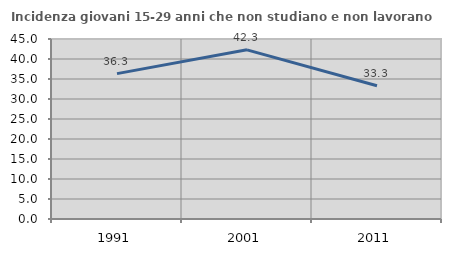
| Category | Incidenza giovani 15-29 anni che non studiano e non lavorano  |
|---|---|
| 1991.0 | 36.338 |
| 2001.0 | 42.288 |
| 2011.0 | 33.311 |